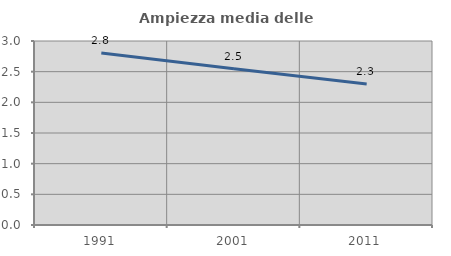
| Category | Ampiezza media delle famiglie |
|---|---|
| 1991.0 | 2.804 |
| 2001.0 | 2.546 |
| 2011.0 | 2.298 |